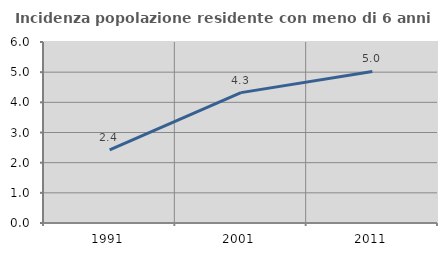
| Category | Incidenza popolazione residente con meno di 6 anni |
|---|---|
| 1991.0 | 2.427 |
| 2001.0 | 4.322 |
| 2011.0 | 5.025 |